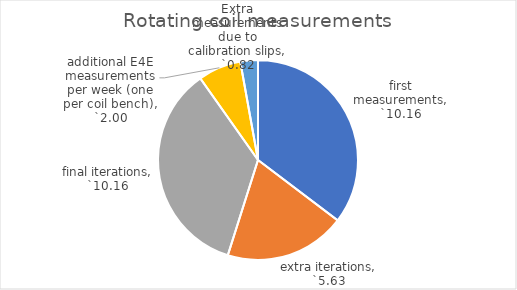
| Category | Rotating coil measurements |
|---|---|
| first measurements | 10.16 |
| extra iterations | 5.626 |
| final iterations | 10.16 |
| additional E4E measurements per week (one per coil bench) | 2 |
| Extra measurements due to calibration slips | 0.816 |